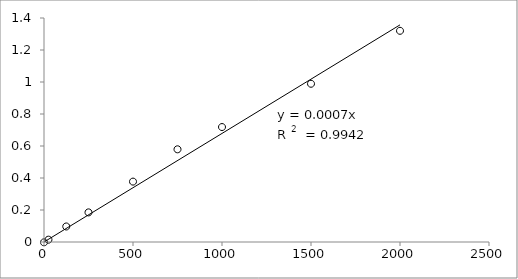
| Category | Series 0 |
|---|---|
| 2000.0 | 1.32 |
| 1500.0 | 0.989 |
| 1000.0 | 0.718 |
| 750.0 | 0.579 |
| 500.0 | 0.378 |
| 250.0 | 0.185 |
| 125.0 | 0.097 |
| 25.0 | 0.014 |
| 0.0 | -0.002 |